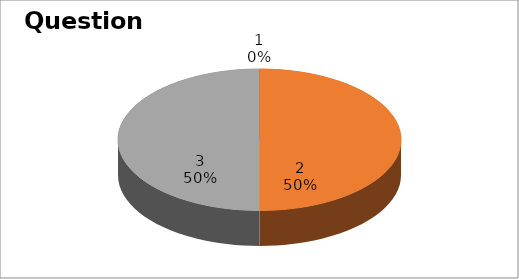
| Category | Series 0 |
|---|---|
| 0 | 0 |
| 1 | 7 |
| 2 | 7 |